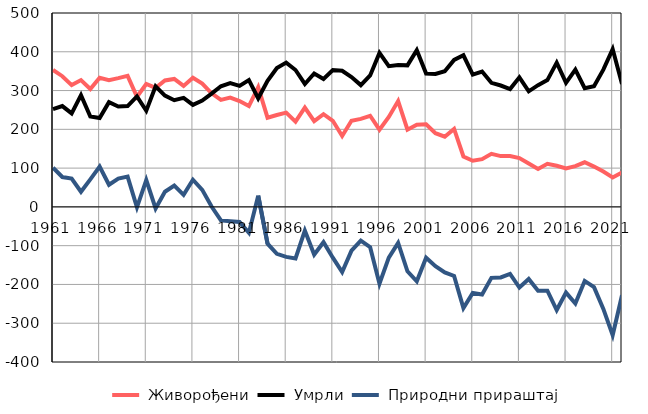
| Category |  Живорођени |  Умрли |  Природни прираштај |
|---|---|---|---|
| 1961.0 | 353 | 252 | 101 |
| 1962.0 | 337 | 260 | 77 |
| 1963.0 | 314 | 241 | 73 |
| 1964.0 | 327 | 288 | 39 |
| 1965.0 | 304 | 233 | 71 |
| 1966.0 | 333 | 229 | 104 |
| 1967.0 | 327 | 270 | 57 |
| 1968.0 | 332 | 259 | 73 |
| 1969.0 | 338 | 260 | 78 |
| 1970.0 | 284 | 285 | -1 |
| 1971.0 | 317 | 248 | 69 |
| 1972.0 | 307 | 311 | -4 |
| 1973.0 | 326 | 287 | 39 |
| 1974.0 | 330 | 275 | 55 |
| 1975.0 | 312 | 281 | 31 |
| 1976.0 | 333 | 263 | 70 |
| 1977.0 | 318 | 274 | 44 |
| 1978.0 | 293 | 292 | 1 |
| 1979.0 | 276 | 311 | -35 |
| 1980.0 | 282 | 319 | -37 |
| 1981.0 | 273 | 312 | -39 |
| 1982.0 | 260 | 327 | -67 |
| 1983.0 | 309 | 280 | 29 |
| 1984.0 | 230 | 325 | -95 |
| 1985.0 | 237 | 358 | -121 |
| 1986.0 | 243 | 372 | -129 |
| 1987.0 | 220 | 353 | -133 |
| 1988.0 | 256 | 317 | -61 |
| 1989.0 | 221 | 344 | -123 |
| 1990.0 | 239 | 330 | -91 |
| 1991.0 | 222 | 353 | -131 |
| 1992.0 | 183 | 351 | -168 |
| 1993.0 | 222 | 335 | -113 |
| 1994.0 | 227 | 314 | -87 |
| 1995.0 | 235 | 339 | -104 |
| 1996.0 | 199 | 397 | -198 |
| 1997.0 | 232 | 363 | -131 |
| 1998.0 | 273 | 366 | -93 |
| 1999.0 | 199 | 365 | -166 |
| 2000.0 | 212 | 404 | -192 |
| 2001.0 | 213 | 344 | -131 |
| 2002.0 | 190 | 343 | -153 |
| 2003.0 | 181 | 350 | -169 |
| 2004.0 | 201 | 379 | -178 |
| 2005.0 | 130 | 391 | -261 |
| 2006.0 | 119 | 341 | -222 |
| 2007.0 | 123 | 349 | -226 |
| 2008.0 | 137 | 320 | -183 |
| 2009.0 | 131 | 313 | -182 |
| 2010.0 | 131 | 304 | -173 |
| 2011.0 | 126 | 334 | -208 |
| 2012.0 | 112 | 298 | -186 |
| 2013.0 | 98 | 314 | -216 |
| 2014.0 | 111 | 327 | -216 |
| 2015.0 | 106 | 372 | -266 |
| 2016.0 | 99 | 320 | -221 |
| 2017.0 | 105 | 354 | -249 |
| 2018.0 | 115 | 306 | -191 |
| 2019.0 | 104 | 311 | -207 |
| 2020.0 | 91 | 354 | -263 |
| 2021.0 | 76 | 407 | -331 |
| 2022.0 | 89 | 317 | -228 |